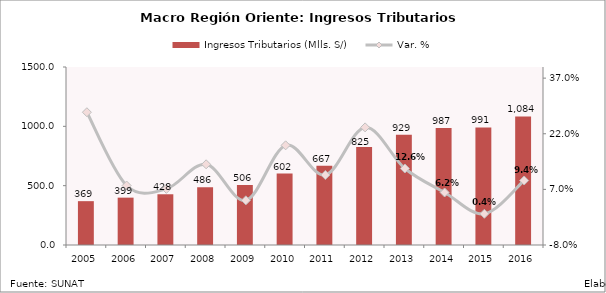
| Category | Ingresos Tributarios (Mlls. S/) |
|---|---|
| 2005.0 | 369.416 |
| 2006.0 | 399.093 |
| 2007.0 | 427.581 |
| 2008.0 | 486.417 |
| 2009.0 | 506.04 |
| 2010.0 | 601.548 |
| 2011.0 | 666.989 |
| 2012.0 | 825.175 |
| 2013.0 | 929.391 |
| 2014.0 | 986.652 |
| 2015.0 | 990.766 |
| 2016.0 | 1083.844 |